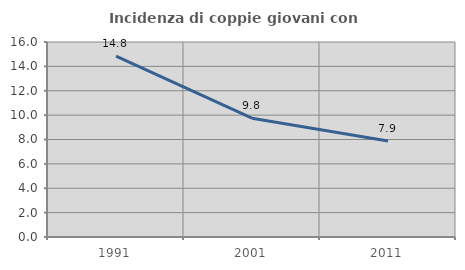
| Category | Incidenza di coppie giovani con figli |
|---|---|
| 1991.0 | 14.839 |
| 2001.0 | 9.751 |
| 2011.0 | 7.876 |